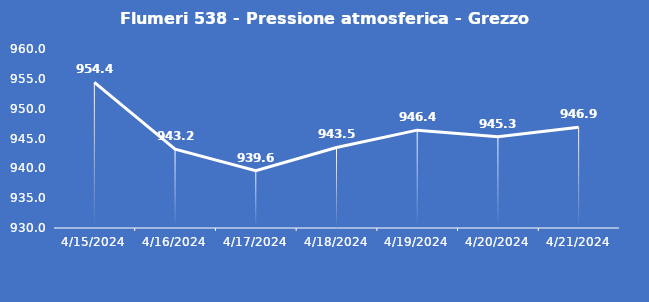
| Category | Flumeri 538 - Pressione atmosferica - Grezzo (hPa) |
|---|---|
| 4/15/24 | 954.4 |
| 4/16/24 | 943.2 |
| 4/17/24 | 939.6 |
| 4/18/24 | 943.5 |
| 4/19/24 | 946.4 |
| 4/20/24 | 945.3 |
| 4/21/24 | 946.9 |